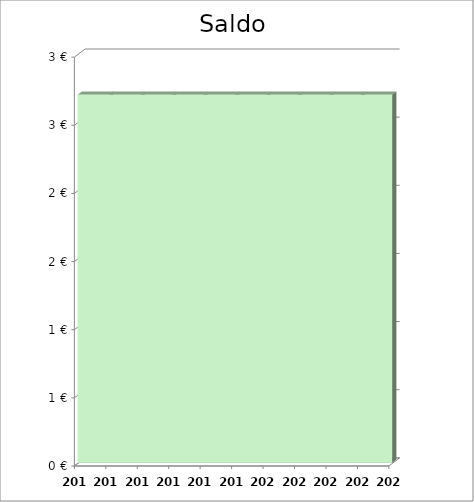
| Category | Saldo |
|---|---|
| 2014.0 | 2.7 |
| 2015.0 | 2.7 |
| 2016.0 | 2.7 |
| 2017.0 | 2.7 |
| 2018.0 | 2.7 |
| 2019.0 | 2.7 |
| 2020.0 | 2.7 |
| 2021.0 | 2.7 |
| 2022.0 | 2.7 |
| 2023.0 | 2.7 |
| 2024.0 | 2.7 |